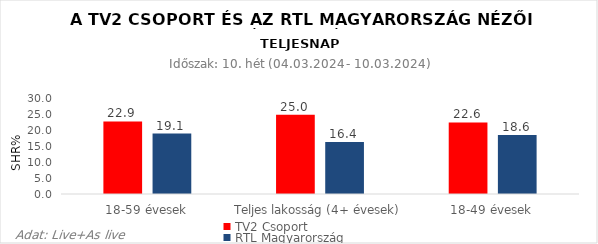
| Category | TV2 Csoport | RTL Magyarország |
|---|---|---|
| 18-59 évesek | 22.9 | 19.1 |
| Teljes lakosság (4+ évesek) | 25 | 16.4 |
| 18-49 évesek | 22.6 | 18.6 |